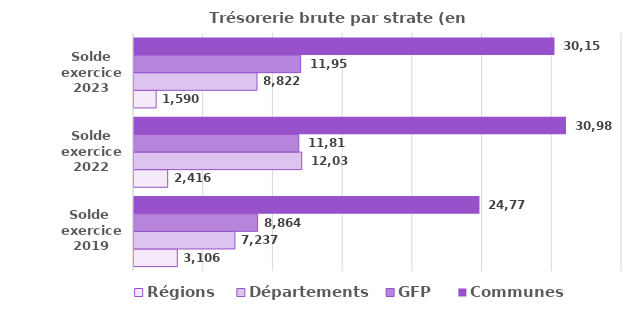
| Category | Régions | Départements | GFP | Communes  |
|---|---|---|---|---|
| Solde 
exercice 2019 | 3105.9 | 7236.7 | 8863.9 | 24777.7 |
| Solde
exercice 2022 | 2415.6 | 12031.2 | 11819.4 | 30981 |
| Solde
exercice 2023 | 1589.6 | 8822 | 11953 | 30157 |